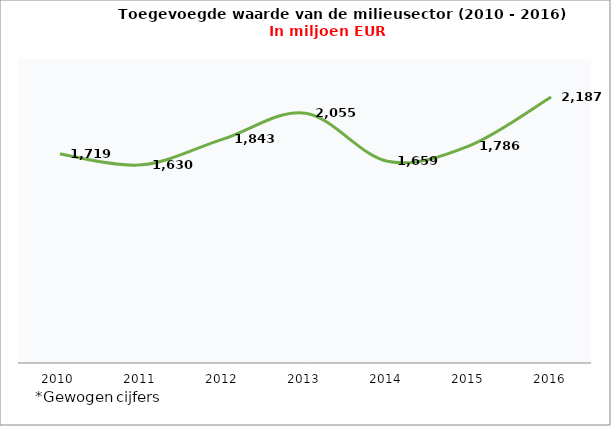
| Category | Series 0 |
|---|---|
| 2010.0 | 1719.115 |
| 2011.0 | 1629.545 |
| 2012.0 | 1842.594 |
| 2013.0 | 2054.694 |
| 2014.0 | 1659.168 |
| 2015.0 | 1785.788 |
| 2016.0 | 2187.007 |